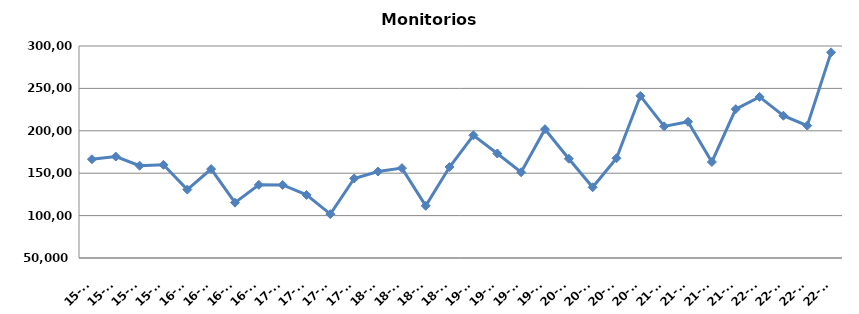
| Category | Monitorios ingresados |
|---|---|
| 15-T1 | 166433 |
| 15-T2 | 169612 |
| 15-T3 | 158859 |
| 15-T4 | 159890 |
| 16-T1 | 130680 |
| 16-T2 | 154860 |
| 16-T3 | 115269 |
| 16-T4 | 136245 |
| 17-T1 | 136155 |
| 17-T2 | 124382 |
| 17-T3 | 101751 |
| 17-T4 | 143788 |
| 18-T1 | 151974 |
| 18-T2 | 155991 |
| 18-T3 | 111544 |
| 18-T4 | 157337 |
| 19-T1 | 194715 |
| 19-T2 | 173225 |
| 19-T3 | 151156 |
| 19-T4 | 201895 |
| 20-T1 | 167095 |
| 20-T2 | 133351 |
| 20-T3 | 167630 |
| 20-T4 | 241119 |
| 21-T1 | 205212 |
| 21-T2 | 210679 |
| 21-T3 | 163259 |
| 21-T4 | 225536 |
| 22-T1 | 239972 |
| 22-T2 | 217801 |
| 22-T3 | 206093 |
| 22-T4 | 292517 |